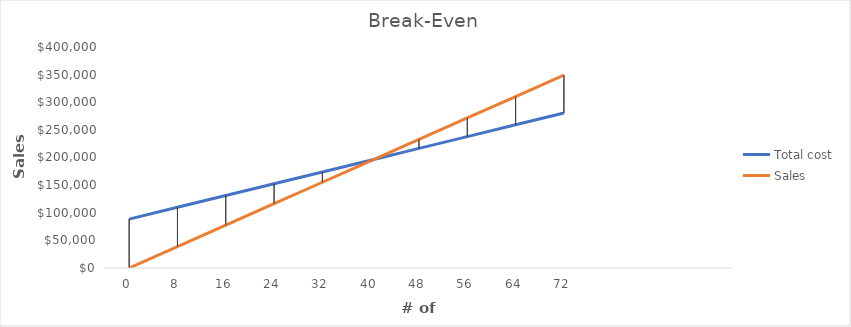
| Category | Total cost | Sales |
|---|---|---|
| 0.0 | 88500 | 0 |
| 8.0 | 109828.914 | 38800 |
| 16.0 | 131157.829 | 77600 |
| 24.0 | 152486.743 | 116400 |
| 32.0 | 173815.657 | 155200 |
| 40.0 | 195144.571 | 194000 |
| 48.0 | 216473.486 | 232800 |
| 56.0 | 237802.4 | 271600 |
| 64.0 | 259131.314 | 310400 |
| 72.0 | 280460.229 | 349200 |